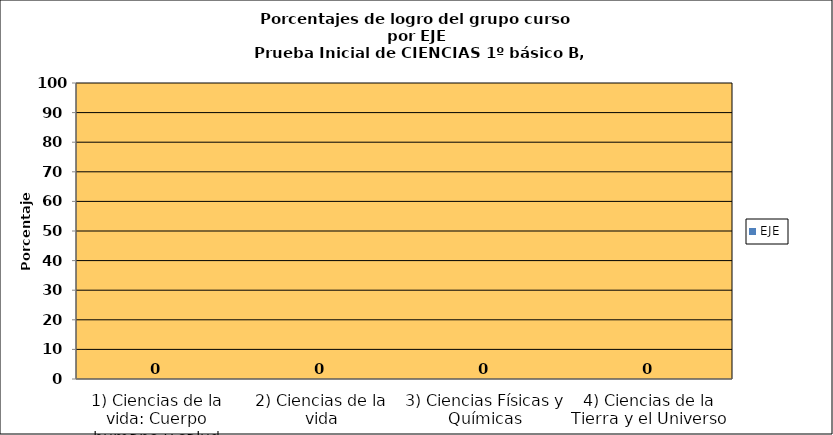
| Category | EJE |
|---|---|
| 1) Ciencias de la vida: Cuerpo humano y salud | 0 |
| 2) Ciencias de la vida | 0 |
| 3) Ciencias Físicas y Químicas | 0 |
| 4) Ciencias de la Tierra y el Universo | 0 |